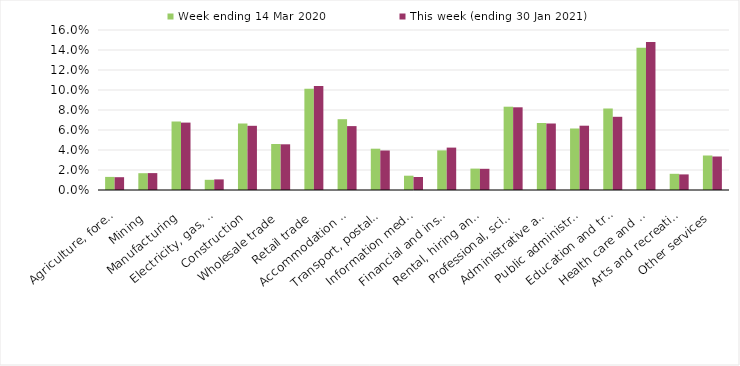
| Category | Week ending 14 Mar 2020 | This week (ending 30 Jan 2021) |
|---|---|---|
| Agriculture, forestry and fishing | 0.013 | 0.013 |
| Mining | 0.017 | 0.017 |
| Manufacturing | 0.068 | 0.067 |
| Electricity, gas, water and waste services | 0.01 | 0.011 |
| Construction | 0.066 | 0.064 |
| Wholesale trade | 0.046 | 0.046 |
| Retail trade | 0.101 | 0.104 |
| Accommodation and food services | 0.071 | 0.064 |
| Transport, postal and warehousing | 0.041 | 0.04 |
| Information media and telecommunications | 0.014 | 0.013 |
| Financial and insurance services | 0.04 | 0.042 |
| Rental, hiring and real estate services | 0.021 | 0.021 |
| Professional, scientific and technical services | 0.083 | 0.083 |
| Administrative and support services | 0.067 | 0.066 |
| Public administration and safety | 0.062 | 0.064 |
| Education and training | 0.082 | 0.073 |
| Health care and social assistance | 0.142 | 0.148 |
| Arts and recreation services | 0.016 | 0.016 |
| Other services | 0.034 | 0.034 |